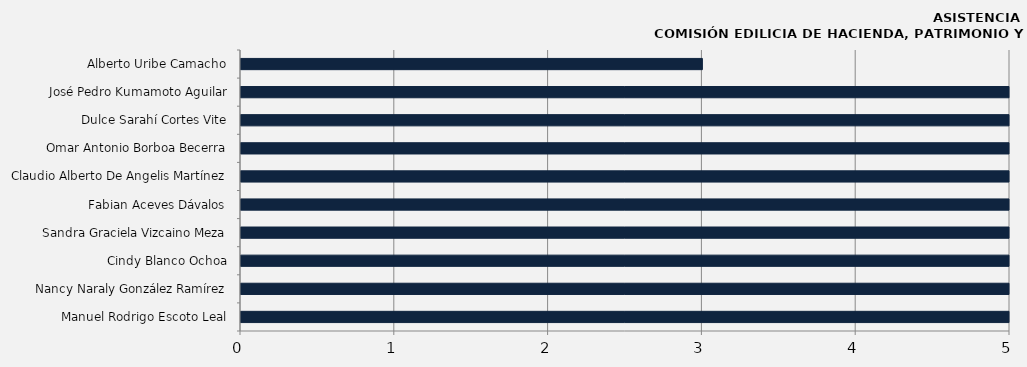
| Category | Manuel Rodrigo Escoto Leal |
|---|---|
| Manuel Rodrigo Escoto Leal | 13 |
| Nancy Naraly González Ramírez | 12 |
| Cindy Blanco Ochoa | 10 |
| Sandra Graciela Vizcaino Meza | 9 |
| Fabian Aceves Dávalos | 13 |
| Claudio Alberto De Angelis Martínez | 12 |
| Omar Antonio Borboa Becerra | 9 |
| Dulce Sarahí Cortes Vite | 9 |
| José Pedro Kumamoto Aguilar | 11 |
| Alberto Uribe Camacho | 3 |